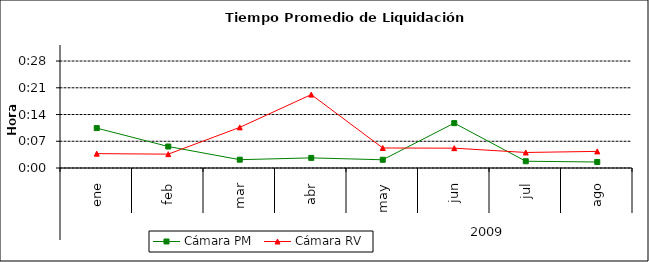
| Category | Cámara PM | Cámara RV |
|---|---|---|
| 0 | 0.007 | 0.003 |
| 1 | 0.004 | 0.003 |
| 2 | 0.002 | 0.008 |
| 3 | 0.002 | 0.014 |
| 4 | 0.002 | 0.004 |
| 5 | 0.008 | 0.004 |
| 6 | 0.001 | 0.003 |
| 7 | 0.001 | 0.003 |